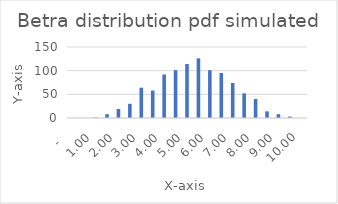
| Category | Series 0 |
|---|---|
| 0.0 | 0 |
| 0.5 | 0 |
| 1.0 | 1 |
| 1.5 | 8 |
| 2.0 | 19 |
| 2.5 | 30 |
| 3.0 | 64 |
| 3.5 | 58 |
| 4.0 | 92 |
| 4.5 | 101 |
| 5.0 | 114 |
| 5.5 | 126 |
| 6.0 | 101 |
| 6.5 | 95 |
| 7.0 | 74 |
| 7.5 | 52 |
| 8.0 | 40 |
| 8.5 | 14 |
| 9.0 | 8 |
| 9.5 | 3 |
| 10.0 | 0 |